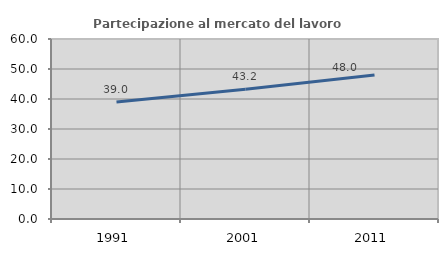
| Category | Partecipazione al mercato del lavoro  femminile |
|---|---|
| 1991.0 | 38.988 |
| 2001.0 | 43.248 |
| 2011.0 | 48.018 |